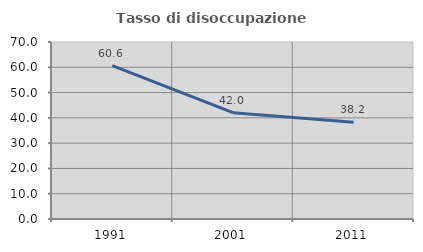
| Category | Tasso di disoccupazione giovanile  |
|---|---|
| 1991.0 | 60.633 |
| 2001.0 | 42.045 |
| 2011.0 | 38.235 |